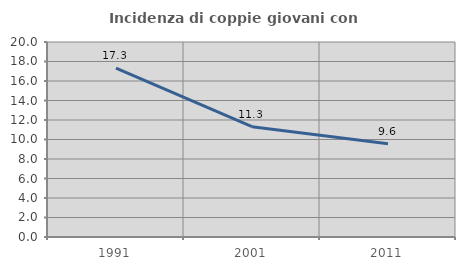
| Category | Incidenza di coppie giovani con figli |
|---|---|
| 1991.0 | 17.323 |
| 2001.0 | 11.311 |
| 2011.0 | 9.559 |